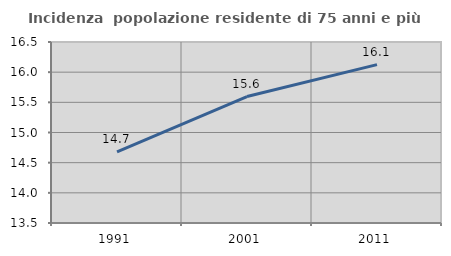
| Category | Incidenza  popolazione residente di 75 anni e più |
|---|---|
| 1991.0 | 14.68 |
| 2001.0 | 15.595 |
| 2011.0 | 16.126 |